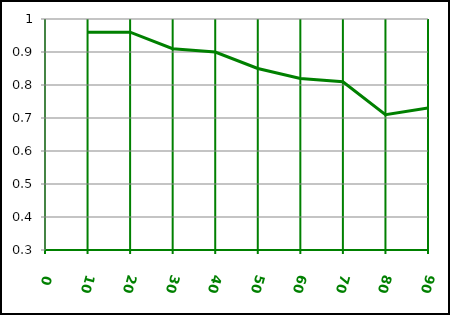
| Category | Series 0 |
|---|---|
| 10.0 | 0.96 |
| 20.0 | 0.96 |
| 30.0 | 0.91 |
| 40.0 | 0.9 |
| 50.0 | 0.85 |
| 60.0 | 0.82 |
| 70.0 | 0.81 |
| 80.0 | 0.71 |
| 90.0 | 0.73 |